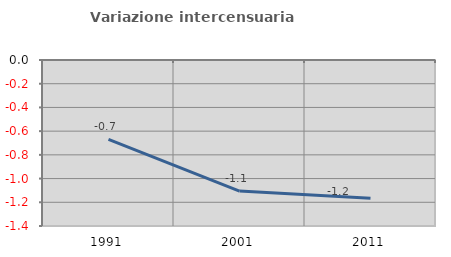
| Category | Variazione intercensuaria annua |
|---|---|
| 1991.0 | -0.669 |
| 2001.0 | -1.106 |
| 2011.0 | -1.165 |